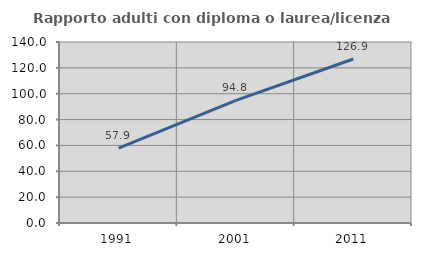
| Category | Rapporto adulti con diploma o laurea/licenza media  |
|---|---|
| 1991.0 | 57.925 |
| 2001.0 | 94.828 |
| 2011.0 | 126.861 |